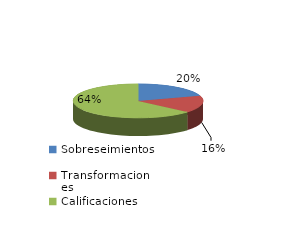
| Category | Series 0 |
|---|---|
| Sobreseimientos | 346 |
| Transformaciones | 279 |
| Calificaciones | 1096 |